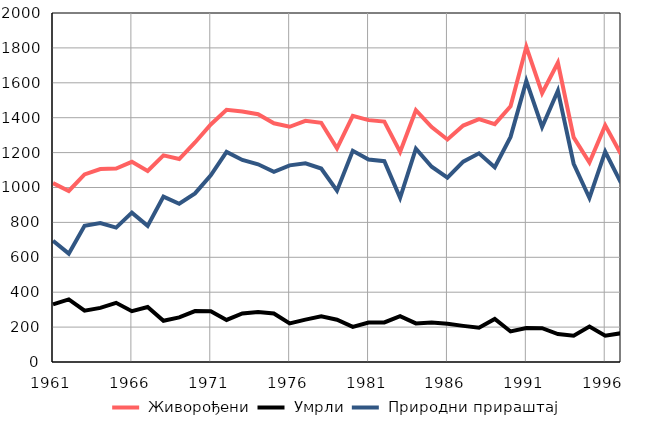
| Category |  Живорођени |  Умрли |  Природни прираштај |
|---|---|---|---|
| 1961.0 | 1025 | 330 | 695 |
| 1962.0 | 980 | 359 | 621 |
| 1963.0 | 1075 | 294 | 781 |
| 1964.0 | 1106 | 310 | 796 |
| 1965.0 | 1109 | 339 | 770 |
| 1966.0 | 1147 | 291 | 856 |
| 1967.0 | 1095 | 315 | 780 |
| 1968.0 | 1184 | 236 | 948 |
| 1969.0 | 1163 | 256 | 907 |
| 1970.0 | 1258 | 292 | 966 |
| 1971.0 | 1361 | 291 | 1070 |
| 1972.0 | 1445 | 241 | 1204 |
| 1973.0 | 1436 | 278 | 1158 |
| 1974.0 | 1420 | 287 | 1133 |
| 1975.0 | 1368 | 278 | 1090 |
| 1976.0 | 1348 | 221 | 1127 |
| 1977.0 | 1382 | 243 | 1139 |
| 1978.0 | 1371 | 262 | 1109 |
| 1979.0 | 1224 | 242 | 982 |
| 1980.0 | 1411 | 201 | 1210 |
| 1981.0 | 1386 | 226 | 1160 |
| 1982.0 | 1378 | 227 | 1151 |
| 1983.0 | 1204 | 263 | 941 |
| 1984.0 | 1443 | 221 | 1222 |
| 1985.0 | 1346 | 227 | 1119 |
| 1986.0 | 1275 | 219 | 1056 |
| 1987.0 | 1355 | 207 | 1148 |
| 1988.0 | 1392 | 196 | 1196 |
| 1989.0 | 1363 | 247 | 1116 |
| 1990.0 | 1465 | 175 | 1290 |
| 1991.0 | 1806 | 195 | 1611 |
| 1992.0 | 1541 | 194 | 1347 |
| 1993.0 | 1715 | 160 | 1555 |
| 1994.0 | 1287 | 151 | 1136 |
| 1995.0 | 1143 | 203 | 940 |
| 1996.0 | 1356 | 151 | 1205 |
| 1997.0 | 1191 | 165 | 1026 |